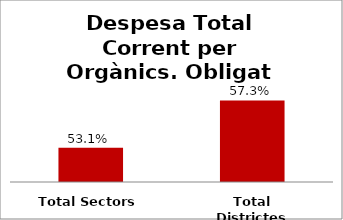
| Category | Series 0 |
|---|---|
| Total Sectors | 0.531 |
| Total Districtes | 0.573 |